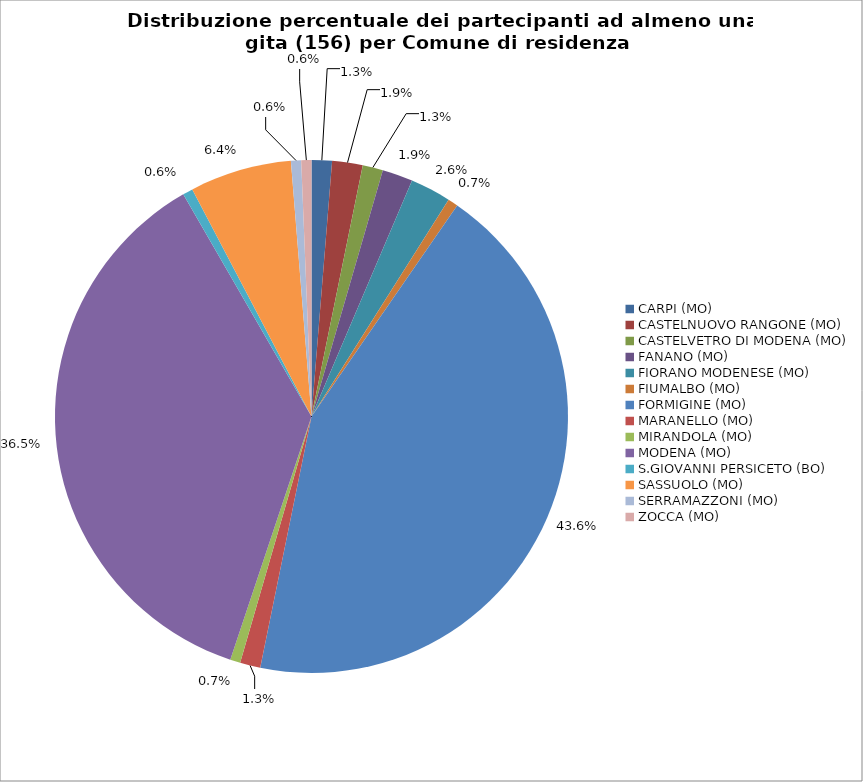
| Category | Nr. Tesserati |
|---|---|
| CARPI (MO) | 2 |
| CASTELNUOVO RANGONE (MO) | 3 |
| CASTELVETRO DI MODENA (MO) | 2 |
| FANANO (MO) | 3 |
| FIORANO MODENESE (MO) | 4 |
| FIUMALBO (MO) | 1 |
| FORMIGINE (MO) | 68 |
| MARANELLO (MO) | 2 |
| MIRANDOLA (MO) | 1 |
| MODENA (MO) | 57 |
| S.GIOVANNI PERSICETO (BO) | 1 |
| SASSUOLO (MO) | 10 |
| SERRAMAZZONI (MO) | 1 |
| ZOCCA (MO) | 1 |